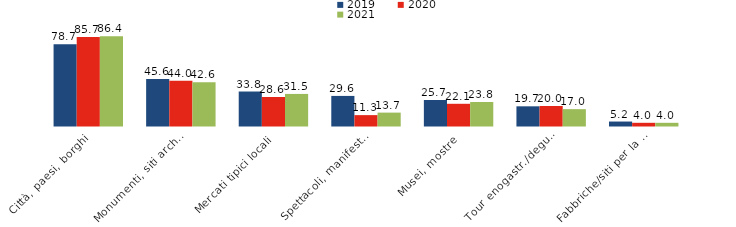
| Category | 2019 | 2020 | 2021 |
|---|---|---|---|
| Città, paesi, borghi | 78.7 | 85.7 | 86.4 |
| Monumenti, siti archeologici | 45.6 | 44 | 42.6 |
| Mercati tipici locali | 33.8 | 28.6 | 31.5 |
| Spettacoli, manifestazioni | 29.6 | 11.3 | 13.7 |
| Musei, mostre | 25.7 | 22.1 | 23.8 |
| Tour enogastr./degustazioni | 19.7 | 20 | 17 |
| Fabbriche/siti per la produz.di beni  | 5.2 | 4 | 4 |